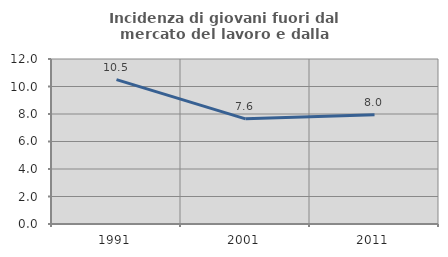
| Category | Incidenza di giovani fuori dal mercato del lavoro e dalla formazione  |
|---|---|
| 1991.0 | 10.503 |
| 2001.0 | 7.65 |
| 2011.0 | 7.951 |